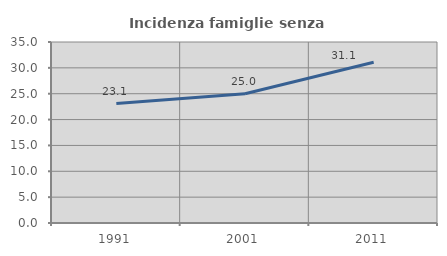
| Category | Incidenza famiglie senza nuclei |
|---|---|
| 1991.0 | 23.099 |
| 2001.0 | 25 |
| 2011.0 | 31.083 |